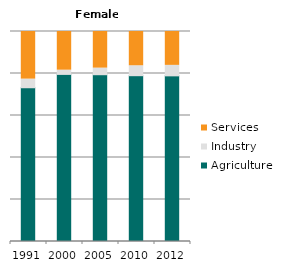
| Category | Agriculture | Industry | Services |
|---|---|---|---|
| 1991.0 | 73.216 | 4.113 | 22.671 |
| 2000.0 | 79.566 | 2.018 | 18.415 |
| 2005.0 | 79.423 | 3.139 | 17.438 |
| 2010.0 | 78.957 | 4.727 | 16.316 |
| 2012.0 | 78.881 | 4.994 | 16.126 |